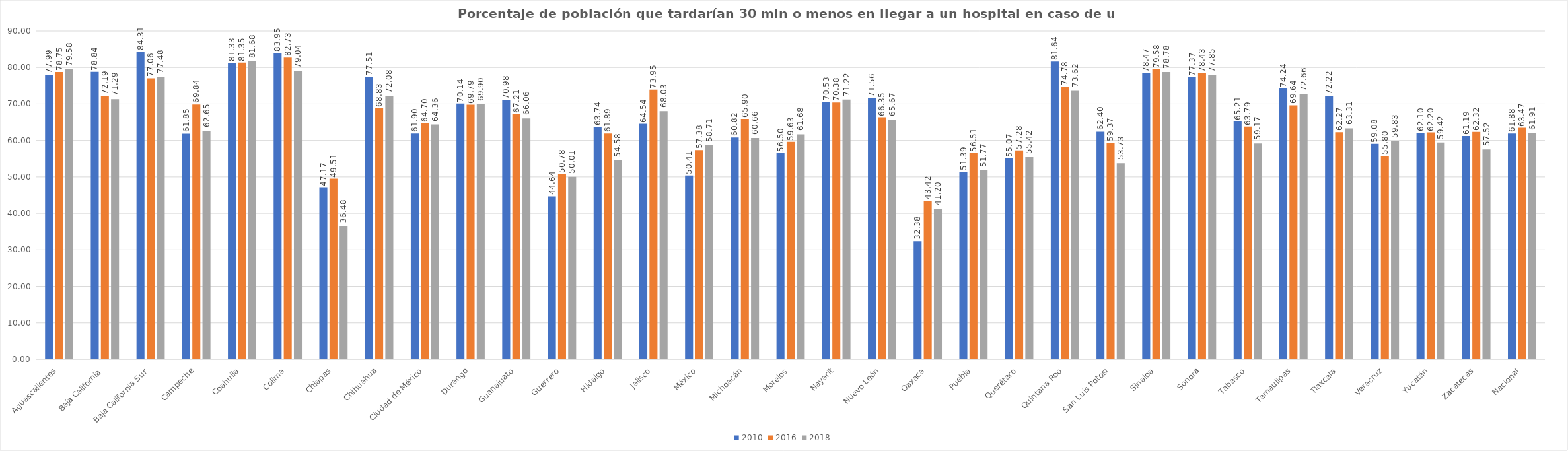
| Category | 2010 | 2016 | 2018 |
|---|---|---|---|
| Aguascalientes | 77.986 | 78.754 | 79.583 |
| Baja California | 78.838 | 72.195 | 71.292 |
| Baja California Sur | 84.313 | 77.056 | 77.482 |
| Campeche | 61.854 | 69.84 | 62.646 |
| Coahuila | 81.33 | 81.349 | 81.676 |
| Colima | 83.951 | 82.726 | 79.038 |
| Chiapas | 47.167 | 49.508 | 36.478 |
| Chihuahua | 77.506 | 68.827 | 72.076 |
| Ciudad de México | 61.904 | 64.7 | 64.355 |
| Durango | 70.138 | 69.792 | 69.904 |
| Guanajuato | 70.983 | 67.214 | 66.06 |
| Guerrero | 44.641 | 50.784 | 50.007 |
| Hidalgo | 63.736 | 61.887 | 54.577 |
| Jalisco | 64.537 | 73.945 | 68.025 |
| México | 50.406 | 57.378 | 58.711 |
| Michoacán | 60.817 | 65.904 | 60.66 |
| Morelos | 56.502 | 59.634 | 61.675 |
| Nayarit | 70.535 | 70.379 | 71.217 |
| Nuevo León | 71.562 | 66.353 | 65.67 |
| Oaxaca | 32.377 | 43.418 | 41.204 |
| Puebla | 51.392 | 56.512 | 51.773 |
| Querétaro | 55.074 | 57.283 | 55.424 |
| Quintana Roo | 81.641 | 74.782 | 73.624 |
| San Luis Potosí | 62.398 | 59.375 | 53.726 |
| Sinaloa | 78.466 | 79.575 | 78.778 |
| Sonora | 77.367 | 78.434 | 77.847 |
| Tabasco | 65.211 | 63.795 | 59.172 |
| Tamaulipas | 74.238 | 69.64 | 72.657 |
| Tlaxcala | 72.217 | 62.27 | 63.307 |
| Veracruz | 59.076 | 55.796 | 59.826 |
| Yucatán | 62.105 | 62.196 | 59.423 |
| Zacatecas | 61.192 | 62.323 | 57.523 |
| Nacional | 61.883 | 63.467 | 61.91 |